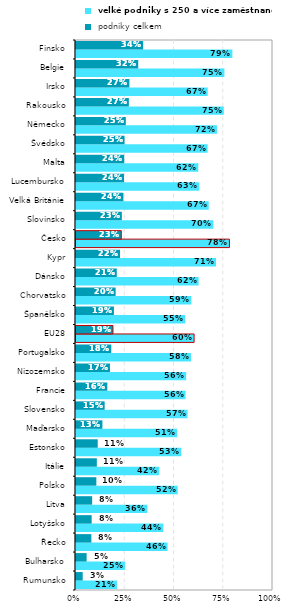
| Category |  velké podniky s 250 a více zaměstnanci |  podniky celkem |
|---|---|---|
| Rumunsko | 0.208 | 0.034 |
| Bulharsko | 0.249 | 0.054 |
| Řecko | 0.465 | 0.078 |
| Lotyšsko | 0.443 | 0.08 |
| Litva | 0.362 | 0.082 |
| Polsko | 0.516 | 0.103 |
| Itálie | 0.423 | 0.106 |
| Estonsko | 0.534 | 0.11 |
| Maďarsko | 0.513 | 0.134 |
| Slovensko | 0.566 | 0.145 |
| Francie | 0.556 | 0.159 |
| Nizozemsko | 0.559 | 0.172 |
| Portugalsko | 0.584 | 0.179 |
| EU28 | 0.6 | 0.188 |
| Španělsko | 0.554 | 0.193 |
| Chorvatsko | 0.585 | 0.201 |
| Dánsko | 0.623 | 0.207 |
| Kypr | 0.711 | 0.224 |
| Česko | 0.779 | 0.23 |
| Slovinsko | 0.697 | 0.233 |
| Velká Británie | 0.674 | 0.241 |
| Lucembursko | 0.626 | 0.244 |
| Malta | 0.621 | 0.245 |
| Švédsko | 0.668 | 0.247 |
| Německo | 0.716 | 0.253 |
| Rakousko | 0.75 | 0.268 |
| Irsko | 0.668 | 0.271 |
| Belgie | 0.753 | 0.316 |
| Finsko | 0.794 | 0.341 |